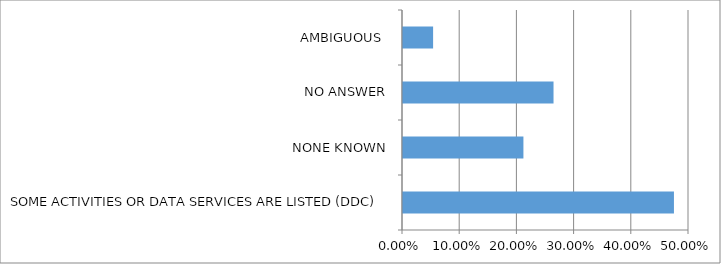
| Category | Series 0 |
|---|---|
| SOME ACTIVITIES OR DATA SERVICES ARE LISTED (DDC) | 0.474 |
| NONE KNOWN | 0.211 |
| NO ANSWER | 0.263 |
| AMBIGUOUS  | 0.053 |